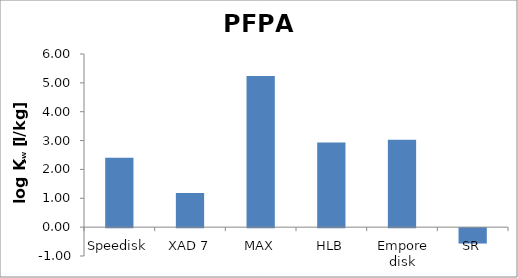
| Category | PFPA  |
|---|---|
| Speedisk | 2.401 |
| XAD 7 | 1.187 |
| MAX | 5.234 |
| HLB | 2.93 |
| Empore disk | 3.026 |
| SR | -0.534 |